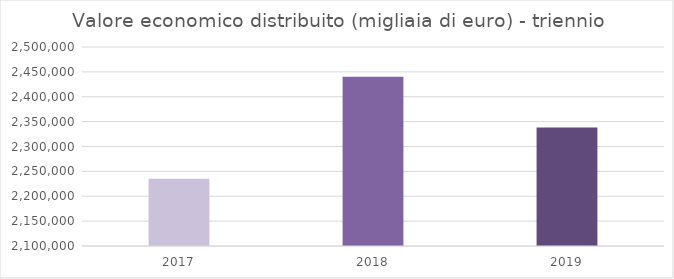
| Category | Series 0 |
|---|---|
| 2017.0 | 2235339 |
| 2018.0 | 2440370 |
| 2019.0 | 2338379 |